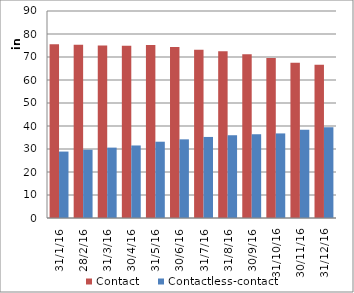
| Category | Contact | Contactless-contact |
|---|---|---|
| 2016-01-31 | 75516 | 28886 |
| 2016-02-28 | 75317 | 29684 |
| 2016-03-31 | 75014 | 30602 |
| 2016-04-30 | 74883 | 31534 |
| 2016-05-31 | 75238 | 33168 |
| 2016-06-30 | 74401 | 34200 |
| 2016-07-31 | 73115 | 35239 |
| 2016-08-31 | 72479 | 35983 |
| 2016-09-30 | 71200 | 36419 |
| 2016-10-31 | 69602 | 36774 |
| 2016-11-30 | 67509 | 38396 |
| 2016-12-31 | 66621 | 39458 |